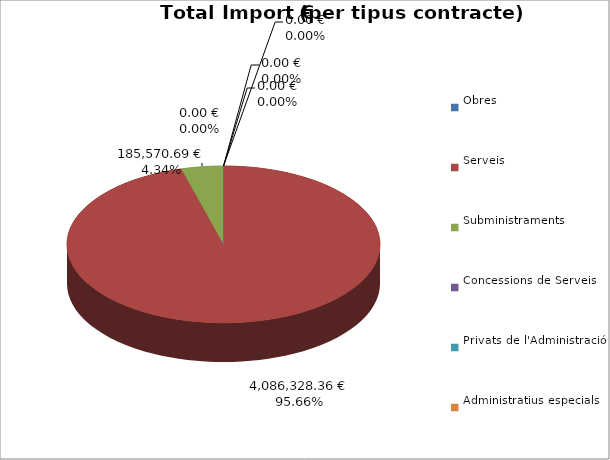
| Category | Total preu
(amb IVA) |
|---|---|
| Obres | 0 |
| Serveis | 4086328.36 |
| Subministraments | 185570.69 |
| Concessions de Serveis | 0 |
| Privats de l'Administració | 0 |
| Administratius especials | 0 |